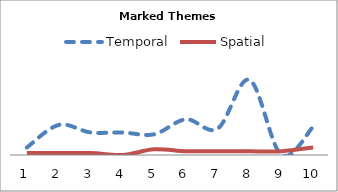
| Category | Temporal | Spatial |
|---|---|---|
| 0 | 4 | 1 |
| 1 | 16 | 1 |
| 2 | 12 | 1 |
| 3 | 12 | 0 |
| 4 | 11 | 3 |
| 5 | 19 | 2 |
| 6 | 14 | 2 |
| 7 | 40 | 2 |
| 8 | 0 | 2 |
| 9 | 15 | 4 |